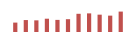
| Category | Importações (2) |
|---|---|
| 0 | 62681.056 |
| 1 | 79621.593 |
| 2 | 77709.867 |
| 3 | 88593.929 |
| 4 | 80744.22 |
| 5 | 85348.563 |
| 6 | 121368.935 |
| 7 | 124143.971 |
| 8 | 115571.707 |
| 9 | 109068.986 |
| 10 | 136096.08 |